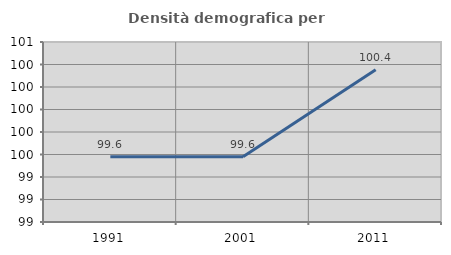
| Category | Densità demografica |
|---|---|
| 1991.0 | 99.58 |
| 2001.0 | 99.58 |
| 2011.0 | 100.353 |